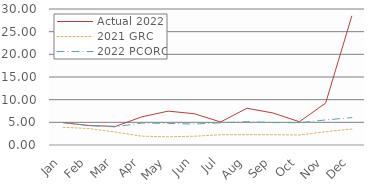
| Category | Actual 2022 | 2021 GRC | 2022 PCORC |
|---|---|---|---|
| Jan | 4.927 | 3.91 | 4.927 |
| Feb | 4.285 | 3.625 | 4.285 |
| Mar | 4.114 | 2.83 | 3.995 |
| Apr | 6.207 | 1.944 | 4.846 |
| May | 7.473 | 1.821 | 4.762 |
| Jun | 6.897 | 1.938 | 4.632 |
| Jul | 5.074 | 2.26 | 4.896 |
| Aug | 8.105 | 2.29 | 5.142 |
| Sep | 7.055 | 2.27 | 4.945 |
| Oct | 5.13 | 2.206 | 4.911 |
| Nov | 9.254 | 2.918 | 5.528 |
| Dec | 28.505 | 3.534 | 6.04 |